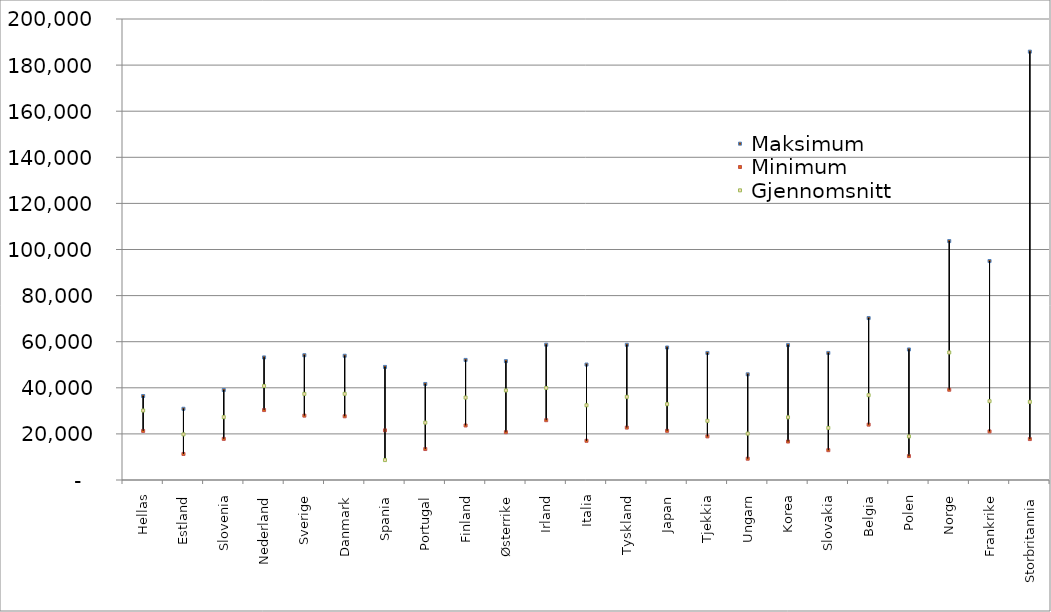
| Category | Maksimum | Minimum | Gjennomsnitt |
|---|---|---|---|
| Hellas | 36440.748 | 21288.925 | 30138.625 |
| Estland | 30899.04 | 11297.523 | 19789.08 |
| Slovenia | 39043.442 | 17847.026 | 27274.506 |
| Nederland | 53177.139 | 30335.716 | 40767.763 |
| Sverige | 54136.377 | 27923.476 | 37357.145 |
| Danmark | 53911.586 | 27639.365 | 37386.271 |
| Spania | 49057.93 | 21531.373 | 8639.984 |
| Portugal | 41668.632 | 13433.115 | 24894.498 |
| Finland | 52099.359 | 23656.445 | 35762.796 |
| Østerrike | 51566.65 | 20740.723 | 38853.634 |
| Irland | 58693.478 | 25942.276 | 39910.989 |
| Italia | 50084.189 | 17009.998 | 32425.721 |
| Tyskland | 58662.807 | 22731.13 | 36080.119 |
| Japan | 57478.83 | 21334.446 | 32897.179 |
| Tjekkia | 55118.297 | 18924.297 | 25673.106 |
| Ungarn | 45852.214 | 9238.671 | 20137.835 |
| Korea | 58526.01 | 16688.678 | 27187.057 |
| Slovakia | 55128.953 | 12937.085 | 22587.157 |
| Belgia | 70249.473 | 24025.18 | 36803.346 |
| Polen | 56631.083 | 10368.987 | 18918.612 |
| Norge | 103649.759 | 39156.73 | 55322.798 |
| Frankrike | 94996.816 | 21073.361 | 34188.855 |
| Storbritannia | 185839.36 | 17756.564 | 33904.211 |